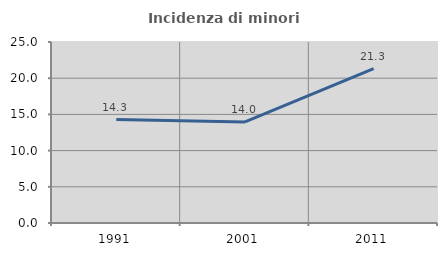
| Category | Incidenza di minori stranieri |
|---|---|
| 1991.0 | 14.286 |
| 2001.0 | 13.953 |
| 2011.0 | 21.311 |